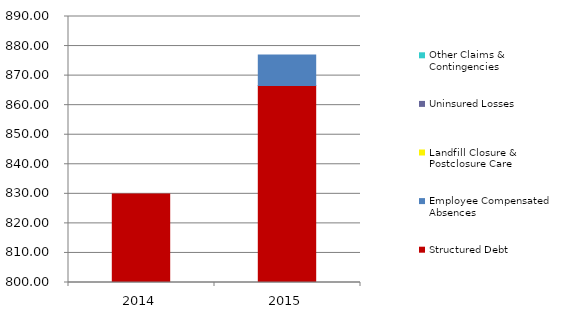
| Category |  Structured Debt  |  Employee Compensated Absences  |  Landfill Closure & Postclosure Care  |  Uninsured Losses  |  Other Claims & Contingencies  |
|---|---|---|---|---|---|
| 2014.0 | 829.98 | 0 | 0 | 0 | 0 |
| 2015.0 | 866.687 | 10.305 | 0 | 0 | 0 |